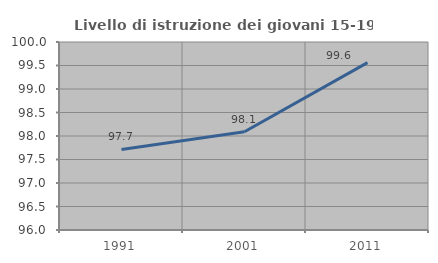
| Category | Livello di istruzione dei giovani 15-19 anni |
|---|---|
| 1991.0 | 97.714 |
| 2001.0 | 98.092 |
| 2011.0 | 99.561 |